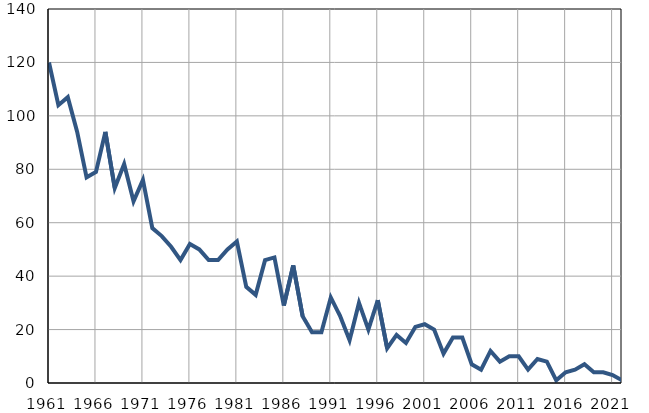
| Category | Умрла 
одојчад |
|---|---|
| 1961.0 | 120 |
| 1962.0 | 104 |
| 1963.0 | 107 |
| 1964.0 | 94 |
| 1965.0 | 77 |
| 1966.0 | 79 |
| 1967.0 | 94 |
| 1968.0 | 73 |
| 1969.0 | 82 |
| 1970.0 | 68 |
| 1971.0 | 76 |
| 1972.0 | 58 |
| 1973.0 | 55 |
| 1974.0 | 51 |
| 1975.0 | 46 |
| 1976.0 | 52 |
| 1977.0 | 50 |
| 1978.0 | 46 |
| 1979.0 | 46 |
| 1980.0 | 50 |
| 1981.0 | 53 |
| 1982.0 | 36 |
| 1983.0 | 33 |
| 1984.0 | 46 |
| 1985.0 | 47 |
| 1986.0 | 29 |
| 1987.0 | 44 |
| 1988.0 | 25 |
| 1989.0 | 19 |
| 1990.0 | 19 |
| 1991.0 | 32 |
| 1992.0 | 25 |
| 1993.0 | 16 |
| 1994.0 | 30 |
| 1995.0 | 20 |
| 1996.0 | 31 |
| 1997.0 | 13 |
| 1998.0 | 18 |
| 1999.0 | 15 |
| 2000.0 | 21 |
| 2001.0 | 22 |
| 2002.0 | 20 |
| 2003.0 | 11 |
| 2004.0 | 17 |
| 2005.0 | 17 |
| 2006.0 | 7 |
| 2007.0 | 5 |
| 2008.0 | 12 |
| 2009.0 | 8 |
| 2010.0 | 10 |
| 2011.0 | 10 |
| 2012.0 | 5 |
| 2013.0 | 9 |
| 2014.0 | 8 |
| 2015.0 | 1 |
| 2016.0 | 4 |
| 2017.0 | 5 |
| 2018.0 | 7 |
| 2019.0 | 4 |
| 2020.0 | 4 |
| 2021.0 | 3 |
| 2022.0 | 1 |